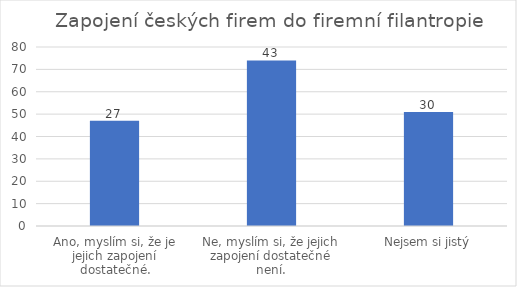
| Category | Počet respondentů |
|---|---|
| Ano, myslím si, že je jejich zapojení dostatečné. | 47 |
| Ne, myslím si, že jejich zapojení dostatečné není. | 74 |
| Nejsem si jistý | 51 |